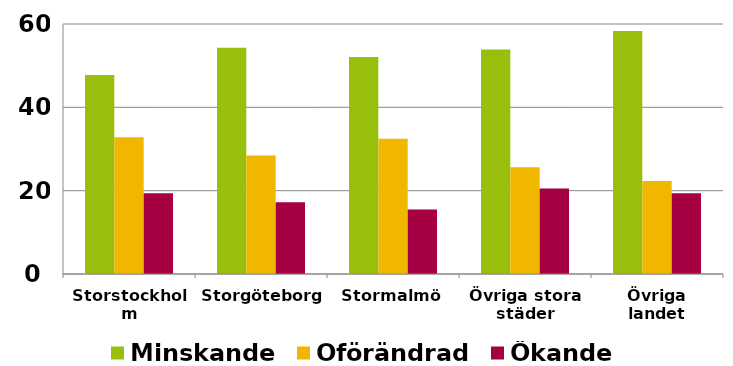
| Category | Minskande | Oförändrad | Ökande |
|---|---|---|---|
| Storstockholm | 47.776 | 32.835 | 19.389 |
| Storgöteborg | 54.293 | 28.458 | 17.25 |
| Stormalmö | 52.102 | 32.432 | 15.465 |
| Övriga stora städer | 53.861 | 25.611 | 20.528 |
| Övriga landet | 58.317 | 22.325 | 19.359 |